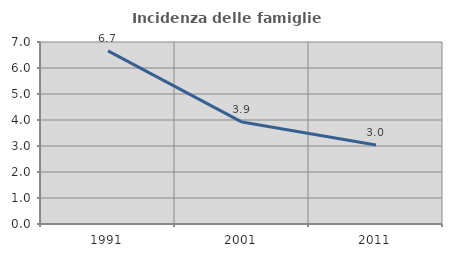
| Category | Incidenza delle famiglie numerose |
|---|---|
| 1991.0 | 6.658 |
| 2001.0 | 3.921 |
| 2011.0 | 3.039 |